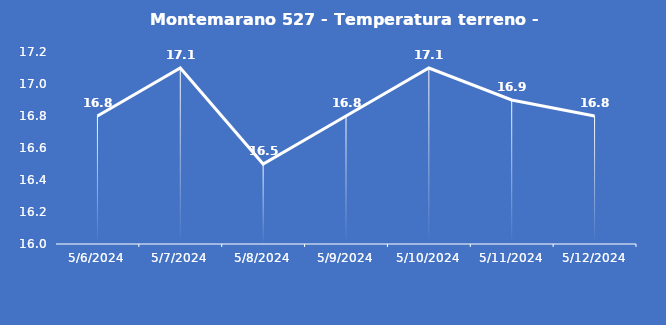
| Category | Montemarano 527 - Temperatura terreno - Grezzo (°C) |
|---|---|
| 5/6/24 | 16.8 |
| 5/7/24 | 17.1 |
| 5/8/24 | 16.5 |
| 5/9/24 | 16.8 |
| 5/10/24 | 17.1 |
| 5/11/24 | 16.9 |
| 5/12/24 | 16.8 |